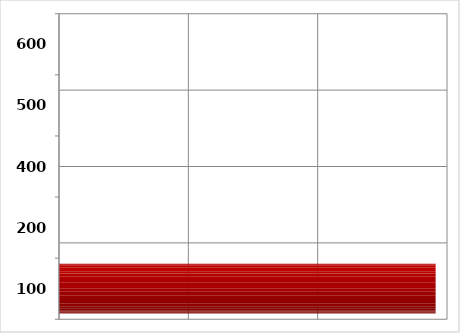
| Category | Series 0 |
|---|---|
| 100.0 | 1455997 |
| 200.0 | 0 |
| 400.0 | 0 |
| 500.0 | 0 |
| 600.0 | 0 |